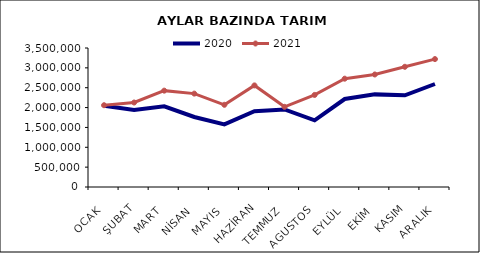
| Category | 2020 | 2021 |
|---|---|---|
| OCAK | 2043227.389 | 2058820.087 |
| ŞUBAT | 1939477.256 | 2127425.455 |
| MART | 2031487.813 | 2426057.185 |
| NİSAN | 1762541.315 | 2351502.058 |
| MAYIS | 1575449.784 | 2070205.889 |
| HAZİRAN | 1910044.099 | 2558072.196 |
| TEMMUZ | 1953689.389 | 2018967.021 |
| AGUSTOS | 1678821.066 | 2318192.406 |
| EYLÜL | 2215682.076 | 2727301.616 |
| EKİM | 2332194.988 | 2833226.158 |
| KASIM | 2307524.598 | 3026786.856 |
| ARALIK | 2593523.168 | 3221017.751 |